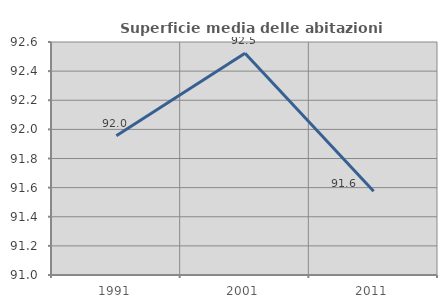
| Category | Superficie media delle abitazioni occupate |
|---|---|
| 1991.0 | 91.956 |
| 2001.0 | 92.523 |
| 2011.0 | 91.575 |